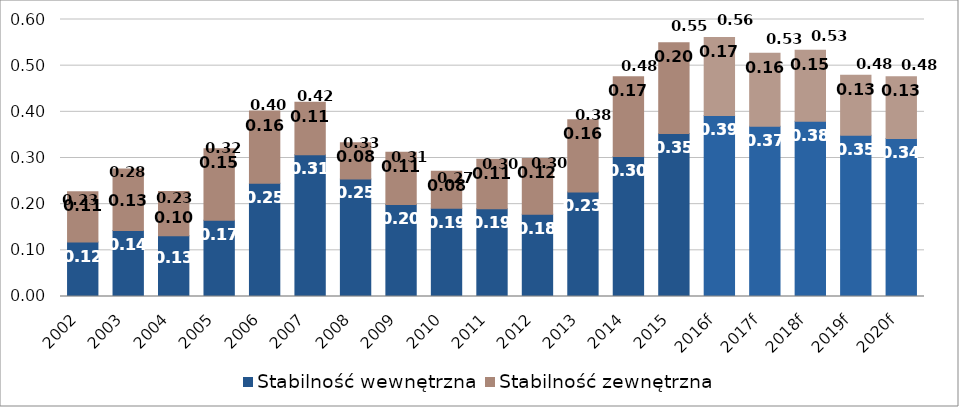
| Category | Stabilność wewnętrzna | Stabilność zewnętrzna |
|---|---|---|
| 2002 | 0.118 | 0.109 |
| 2003 | 0.143 | 0.133 |
| 2004 | 0.132 | 0.096 |
| 2005 | 0.165 | 0.155 |
| 2006 | 0.245 | 0.157 |
| 2007 | 0.307 | 0.114 |
| 2008 | 0.255 | 0.078 |
| 2009 | 0.199 | 0.113 |
| 2010 | 0.191 | 0.08 |
| 2011 | 0.19 | 0.107 |
| 2012 | 0.178 | 0.121 |
| 2013 | 0.227 | 0.156 |
| 2014 | 0.303 | 0.173 |
| 2015 | 0.353 | 0.196 |
| 2016f | 0.392 | 0.169 |
| 2017f | 0.369 | 0.158 |
| 2018f | 0.38 | 0.154 |
| 2019f | 0.349 | 0.13 |
| 2020f | 0.342 | 0.134 |